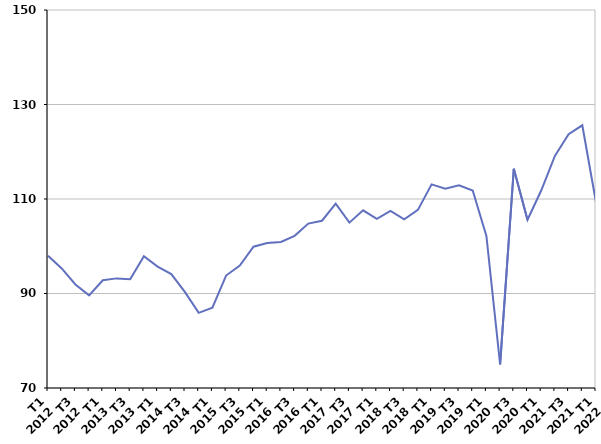
| Category | Reprise d'emploi déclarée |
|---|---|
| T1
2012 | 98 |
| T2
2012 | 95.3 |
| T3
2012 | 91.9 |
| T4
2012 | 89.6 |
| T1
2013 | 92.8 |
| T2
2013 | 93.2 |
| T3
2013 | 93 |
| T4
2013 | 97.9 |
| T1
2014 | 95.7 |
| T2
2014 | 94.1 |
| T3
2014 | 90.3 |
| T4
2014 | 85.9 |
| T1
2015 | 87 |
| T2
2015 | 93.8 |
| T3
2015 | 95.9 |
| T4
2015 | 99.9 |
| T1
2016 | 100.7 |
| T2
2016 | 100.9 |
| T3
2016 | 102.2 |
| T4
2016 | 104.8 |
| T1
2017 | 105.4 |
| T2
2017 | 109 |
| T3
2017 | 105 |
| T4
2017 | 107.6 |
| T1
2018 | 105.8 |
| T2
2018 | 107.5 |
| T3
2018 | 105.7 |
| T4
2018 | 107.7 |
| T1
2019 | 113.1 |
| T2
2019 | 112.2 |
| T3
2019 | 112.9 |
| T4
2019 | 111.8 |
| T1
2020 | 102.2 |
| T2
2020 | 75 |
| T3
2020 | 116.4 |
| T4
2020 | 105.6 |
| T1
2021 | 111.8 |
| T2
2021 | 119.1 |
| T3
2021 | 123.7 |
| T4
2021 | 125.6 |
| T1
2022 | 109.3 |